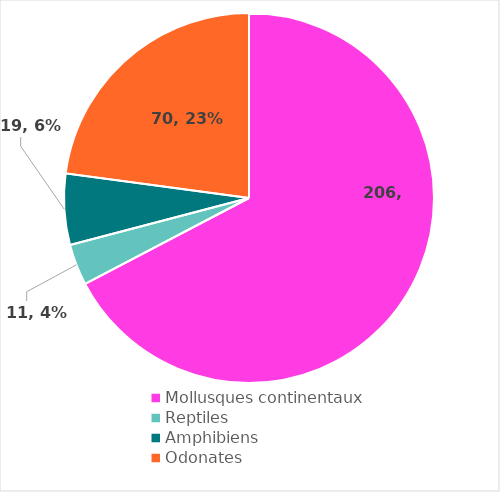
| Category | 206 |
|---|---|
| Mollusques continentaux  | 206 |
| Reptiles | 11 |
| Amphibiens | 19 |
| Odonates | 70 |